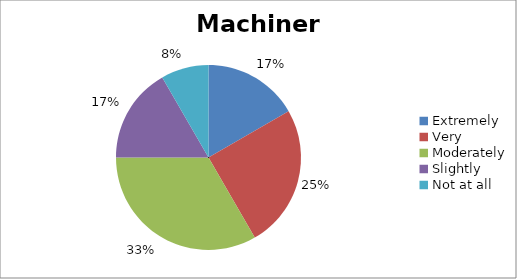
| Category | Machinery |
|---|---|
| Extremely | 2 |
| Very | 3 |
| Moderately | 4 |
| Slightly | 2 |
| Not at all | 1 |